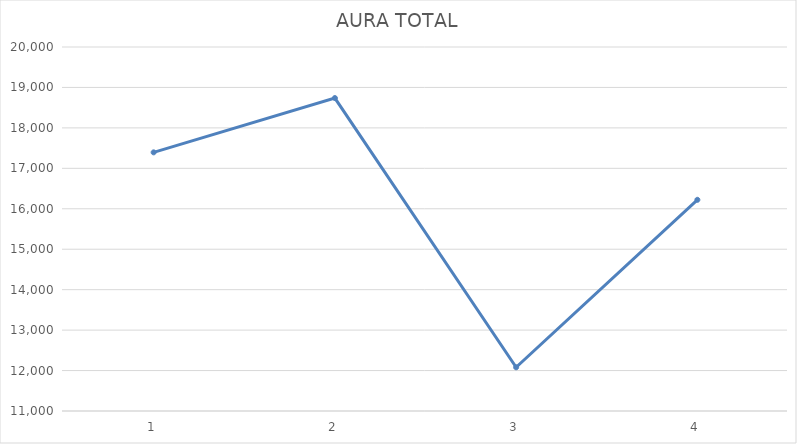
| Category | AURA TOTAL |
|---|---|
| 0 | 17395 |
| 1 | 18738 |
| 2 | 12081 |
| 3 | 16222 |